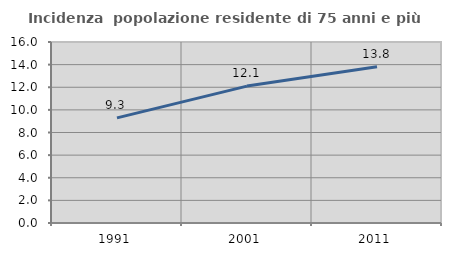
| Category | Incidenza  popolazione residente di 75 anni e più |
|---|---|
| 1991.0 | 9.29 |
| 2001.0 | 12.101 |
| 2011.0 | 13.813 |